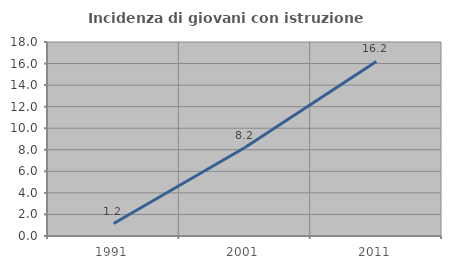
| Category | Incidenza di giovani con istruzione universitaria |
|---|---|
| 1991.0 | 1.154 |
| 2001.0 | 8.209 |
| 2011.0 | 16.194 |